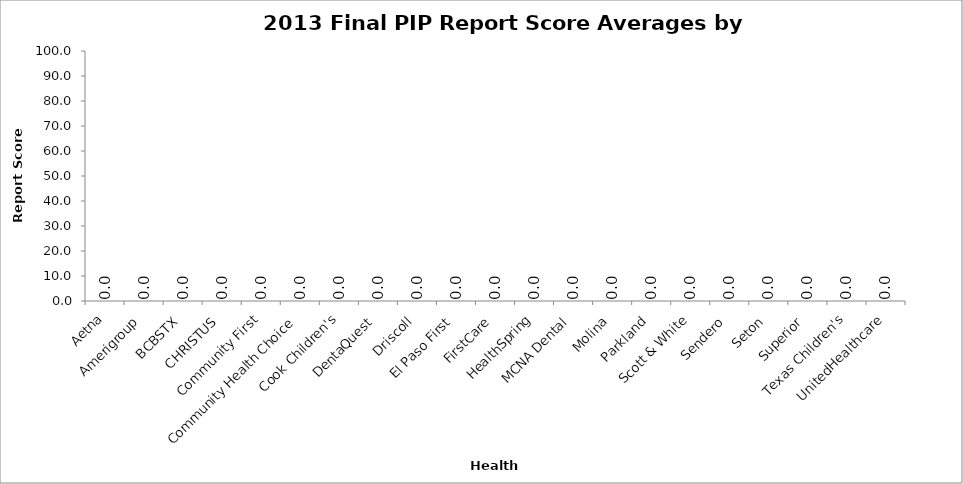
| Category | 2013 Final PIP Report Score Averages by Plan |
|---|---|
| Aetna | 0 |
| Amerigroup | 0 |
| BCBSTX | 0 |
| CHRISTUS | 0 |
| Community First | 0 |
| Community Health Choice | 0 |
| Cook Children's | 0 |
| DentaQuest | 0 |
| Driscoll | 0 |
| El Paso First | 0 |
| FirstCare | 0 |
| HealthSpring | 0 |
| MCNA Dental | 0 |
| Molina | 0 |
| Parkland | 0 |
| Scott & White | 0 |
| Sendero | 0 |
| Seton | 0 |
| Superior | 0 |
| Texas Children's | 0 |
| UnitedHealthcare | 0 |